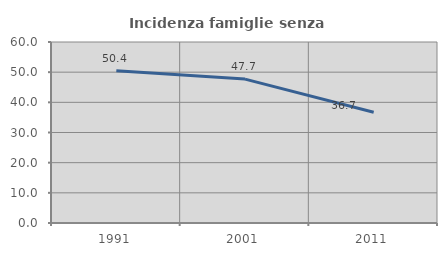
| Category | Incidenza famiglie senza nuclei |
|---|---|
| 1991.0 | 50.442 |
| 2001.0 | 47.706 |
| 2011.0 | 36.735 |